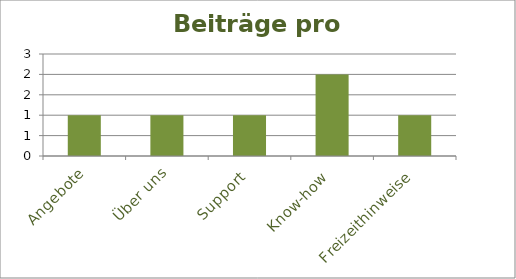
| Category | Beiträge |
|---|---|
| Angebote | 1 |
| Über uns | 1 |
| Support | 1 |
| Know-how | 2 |
| Freizeithinweise | 1 |